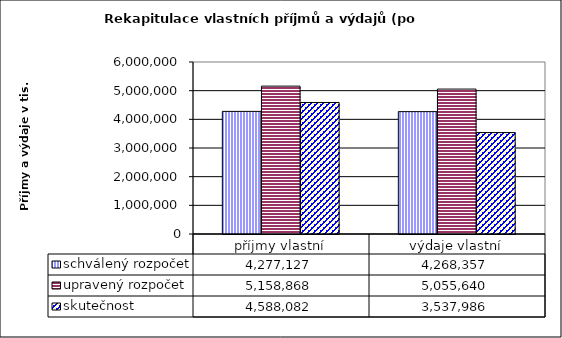
| Category | schválený rozpočet | upravený rozpočet | skutečnost |
|---|---|---|---|
| příjmy vlastní | 4277127 | 5158868 | 4588082 |
| výdaje vlastní | 4268357 | 5055640 | 3537986 |